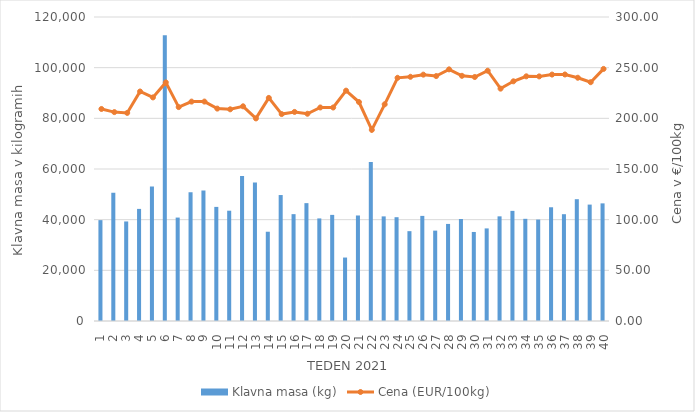
| Category | Klavna masa (kg) |
|---|---|
| 1.0 | 39814 |
| 2.0 | 50603 |
| 3.0 | 39295 |
| 4.0 | 44250 |
| 5.0 | 53061 |
| 6.0 | 112816 |
| 7.0 | 40829 |
| 8.0 | 50775 |
| 9.0 | 51535 |
| 10.0 | 45040 |
| 11.0 | 43536 |
| 12.0 | 57246 |
| 13.0 | 54680 |
| 14.0 | 35237 |
| 15.0 | 49721 |
| 16.0 | 42177 |
| 17.0 | 46525 |
| 18.0 | 40491 |
| 19.0 | 41888 |
| 20.0 | 25048 |
| 21.0 | 41651 |
| 22.0 | 62774 |
| 23.0 | 41297 |
| 24.0 | 40971 |
| 25.0 | 35465 |
| 26.0 | 41489 |
| 27.0 | 35675 |
| 28.0 | 38316 |
| 29.0 | 40265 |
| 30.0 | 35146 |
| 31.0 | 36548 |
| 32.0 | 41314 |
| 33.0 | 43471 |
| 34.0 | 40333 |
| 35.0 | 40041 |
| 36.0 | 44895 |
| 37.0 | 42158 |
| 38.0 | 48077 |
| 39.0 | 45950 |
| 40.0 | 46433 |